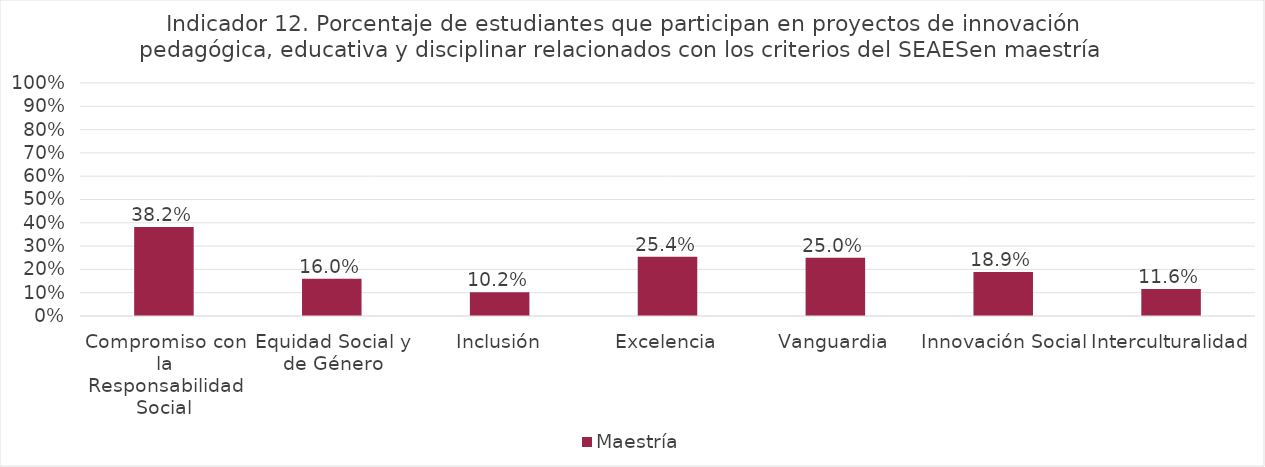
| Category | Maestría |
|---|---|
| Compromiso con la Responsabilidad Social | 0.382 |
| Equidad Social y de Género | 0.16 |
| Inclusión | 0.102 |
| Excelencia | 0.254 |
| Vanguardia | 0.25 |
| Innovación Social | 0.189 |
| Interculturalidad | 0.116 |